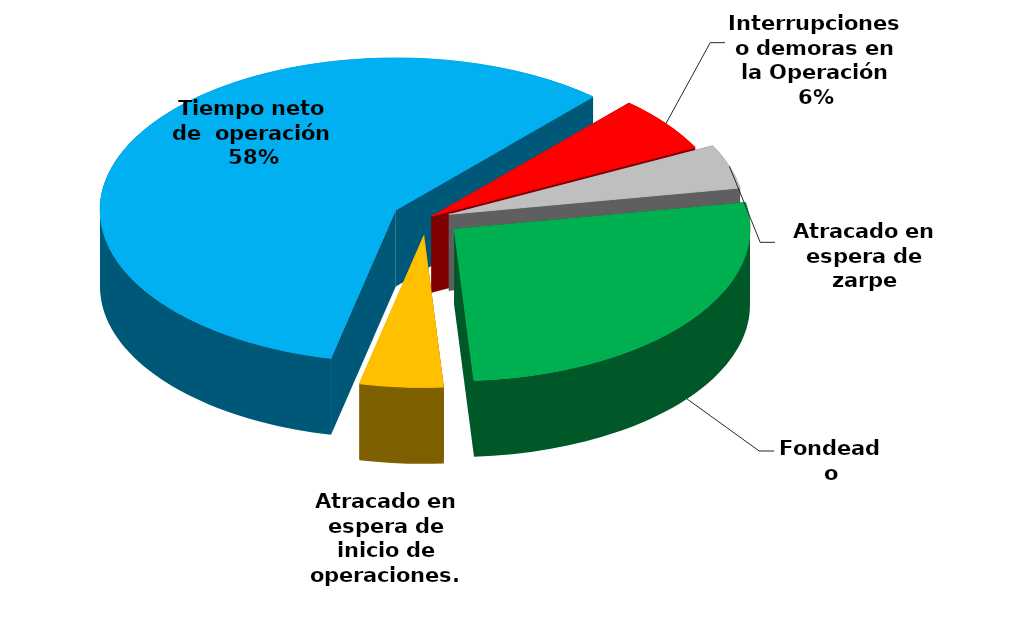
| Category | Series 0 |
|---|---|
| Fondeado | 21726.627 |
| Atracado en espera de inicio de operaciones. | 3720.609 |
| Tiempo neto de  operación | 47266.61 |
| Interrupciones o demoras en la Operación | 4805.06 |
| Atracado en espera de zarpe | 3815.804 |